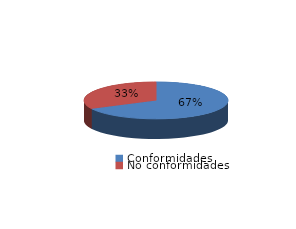
| Category | Series 0 |
|---|---|
| Conformidades | 1718 |
| No conformidades | 828 |